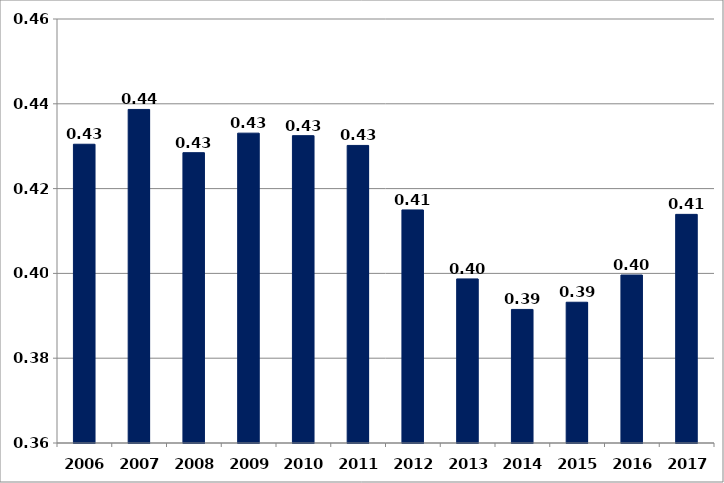
| Category | მთლიანი შემოსავლების მიხედვით1 |
|---|---|
| 2006.0 | 0.43 |
| 2007.0 | 0.439 |
| 2008.0 | 0.428 |
| 2009.0 | 0.433 |
| 2010.0 | 0.432 |
| 2011.0 | 0.43 |
| 2012.0 | 0.415 |
| 2013.0 | 0.399 |
| 2014.0 | 0.392 |
| 2015.0 | 0.393 |
| 2016.0 | 0.4 |
| 2017.0 | 0.414 |